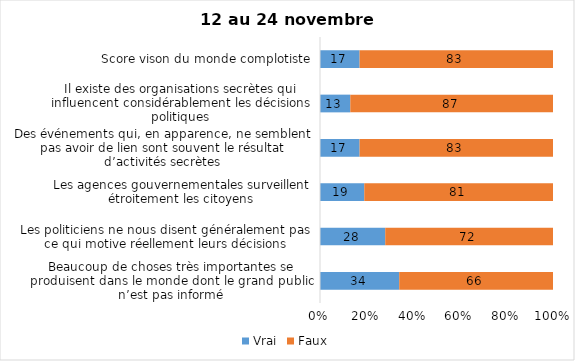
| Category | Vrai | Faux |
|---|---|---|
| Beaucoup de choses très importantes se produisent dans le monde dont le grand public n’est pas informé | 34 | 66 |
| Les politiciens ne nous disent généralement pas ce qui motive réellement leurs décisions | 28 | 72 |
| Les agences gouvernementales surveillent étroitement les citoyens | 19 | 81 |
| Des événements qui, en apparence, ne semblent pas avoir de lien sont souvent le résultat d’activités secrètes | 17 | 83 |
| Il existe des organisations secrètes qui influencent considérablement les décisions politiques | 13 | 87 |
| Score vison du monde complotiste | 17 | 83 |